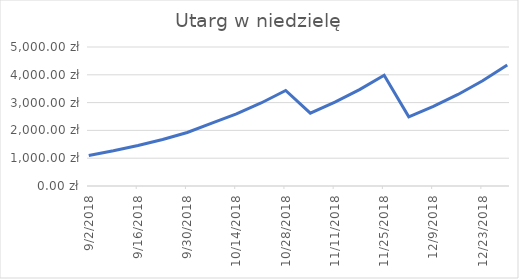
| Category | Utarg w niedzielę |
|---|---|
| 9/2/18 | 1100 |
| 9/9/18 | 1264.982 |
| 9/16/18 | 1454.71 |
| 9/23/18 | 1672.893 |
| 9/30/18 | 1923.8 |
| 10/7/18 | 2258.412 |
| 10/14/18 | 2597.138 |
| 10/21/18 | 2986.667 |
| 10/28/18 | 3434.619 |
| 11/4/18 | 2621.054 |
| 11/11/18 | 3014.17 |
| 11/18/18 | 3466.247 |
| 11/25/18 | 3986.129 |
| 12/2/18 | 2490.111 |
| 12/9/18 | 2863.588 |
| 12/16/18 | 3293.081 |
| 12/23/18 | 3786.99 |
| 12/30/18 | 4354.978 |